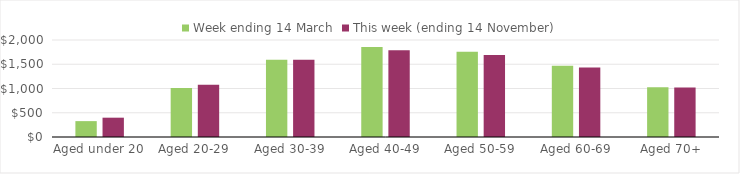
| Category | Week ending 14 March | This week (ending 14 November) |
|---|---|---|
| Aged under 20 | 327.44 | 398.27 |
| Aged 20-29 | 1008.62 | 1078.35 |
| Aged 30-39 | 1594.77 | 1592.94 |
| Aged 40-49 | 1855.62 | 1789 |
| Aged 50-59 | 1758.19 | 1689.19 |
| Aged 60-69 | 1469.25 | 1430.46 |
| Aged 70+ | 1024.64 | 1018.54 |